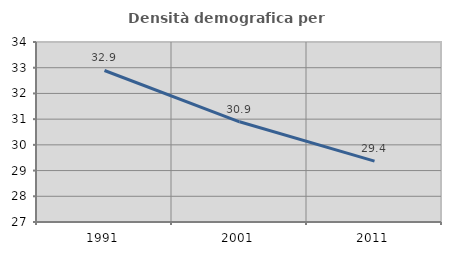
| Category | Densità demografica |
|---|---|
| 1991.0 | 32.892 |
| 2001.0 | 30.897 |
| 2011.0 | 29.369 |